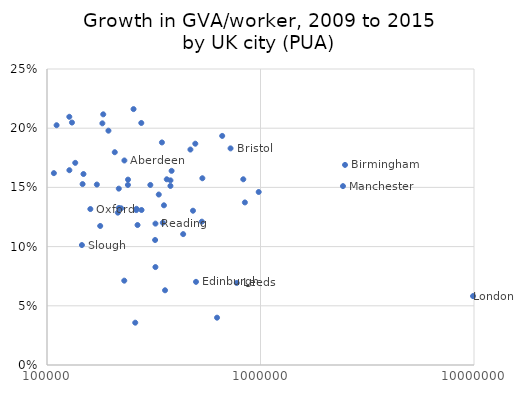
| Category | GVA growth |
|---|---|
| 230400.0 | 0.173 |
| 183400.0 | 0.212 |
| 239300.0 | 0.152 |
| 181700.0 | 0.204 |
| 320900.0 | 0.106 |
| 2488200.0 | 0.169 |
| 146800.0 | 0.153 |
| 216900.0 | 0.149 |
| 482800.0 | 0.13 |
| 531200.0 | 0.121 |
| 348700.0 | 0.12 |
| 724000.0 | 0.183 |
| 177500.0 | 0.117 |
| 130900.0 | 0.205 |
| 357200.0 | 0.063 |
| 276500.0 | 0.204 |
| 345400.0 | 0.188 |
| 110900.0 | 0.203 |
| 254300.0 | 0.216 |
| 304800.0 | 0.152 |
| 148200.0 | 0.161 |
| 498800.0 | 0.07 |
| 127300.0 | 0.165 |
| 980800.0 | 0.146 |
| 127200.0 | 0.21 |
| 434300.0 | 0.111 |
| 259000.0 | 0.036 |
| 135600.0 | 0.171 |
| 774100.0 | 0.069 |
| 495000.0 | 0.187 |
| 625800.0 | 0.04 |
| 214700.0 | 0.058 |
| 2434100.0 | 0.129 |
| 230100.0 | 0.151 |
| 469600.0 | 0.071 |
| 261800.0 | 0.182 |
| 845000.0 | 0.131 |
| 239600.0 | 0.137 |
| 222500.0 | 0.157 |
| 265500.0 | 0.132 |
| 661600.0 | 0.118 |
| 159600.0 | 0.193 |
| 194000.0 | 0.132 |
| 262700.0 | 0.198 |
| 534200.0 | 0.132 |
| 363900.0 | 0.158 |
| 322100.0 | 0.157 |
| 830500.0 | 0.119 |
| 145700.0 | 0.157 |
| 378600.0 | 0.101 |
| 353000.0 | 0.151 |
| 378700.0 | 0.135 |
| 277200.0 | 0.156 |
| 383400.0 | 0.131 |
| 217200.0 | 0.164 |
| 171200.0 | 0.133 |
| 333800.0 | 0.152 |
| 207700.0 | 0.144 |
| 322000.0 | 0.18 |
| 107700.0 | 0.083 |
| 206900.0 | 0.162 |